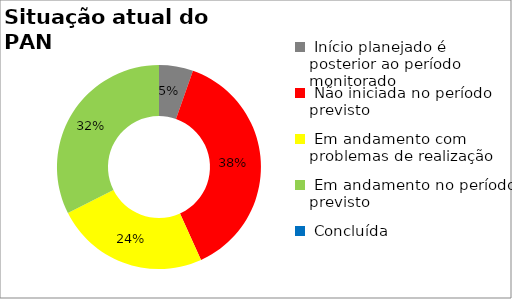
| Category | Series 0 |
|---|---|
|  Início planejado é posterior ao período monitorado | 0.054 |
|  Não iniciada no período previsto | 0.378 |
|  Em andamento com problemas de realização | 0.243 |
|  Em andamento no período previsto  | 0.324 |
|  Concluída | 0 |